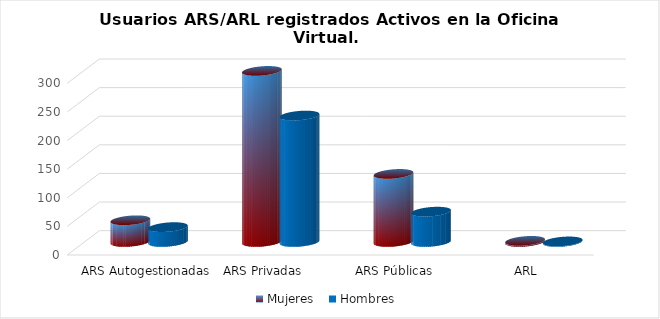
| Category | Mujeres | Hombres |
|---|---|---|
| ARS Autogestionadas | 38 | 26 |
| ARS Privadas | 299 | 221 |
| ARS Públicas | 119 | 53 |
| ARL | 2 | 1 |